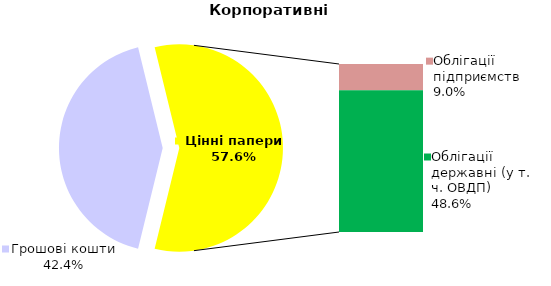
| Category | Корпоративні |
|---|---|
| Грошові кошти | 91.675 |
| Банківські метали | 0 |
| Нерухомість | 0 |
| Інші активи | 0 |
| Акції | 0.038 |
| Облігації підприємств | 19.457 |
| Муніципальні облігації | 0 |
| Облігації державні (у т. ч. ОВДП) | 105.247 |